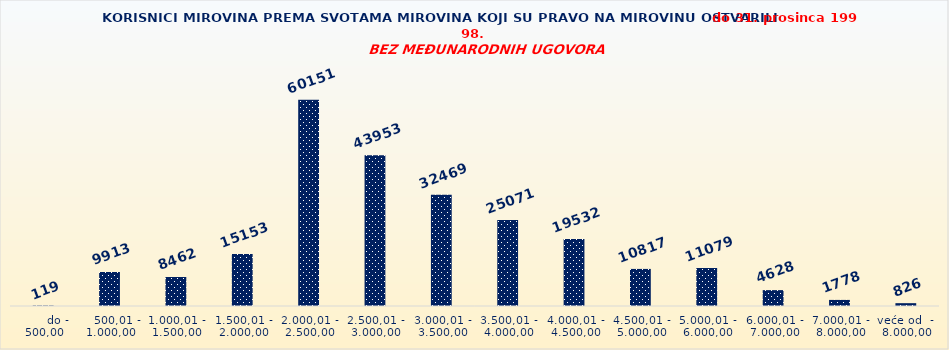
| Category | Series 0 |
|---|---|
|       do - 500,00 | 119 |
|    500,01 - 1.000,00 | 9913 |
| 1.000,01 - 1.500,00 | 8462 |
| 1.500,01 - 2.000,00 | 15153 |
| 2.000,01 - 2.500,00 | 60151 |
| 2.500,01 - 3.000,00 | 43953 |
| 3.000,01 - 3.500,00 | 32469 |
| 3.500,01 - 4.000,00 | 25071 |
| 4.000,01 - 4.500,00 | 19532 |
| 4.500,01 - 5.000,00 | 10817 |
| 5.000,01 - 6.000,00 | 11079 |
| 6.000,01 - 7.000,00 | 4628 |
| 7.000,01 - 8.000,00 | 1778 |
| veće od  -  8.000,00 | 826 |